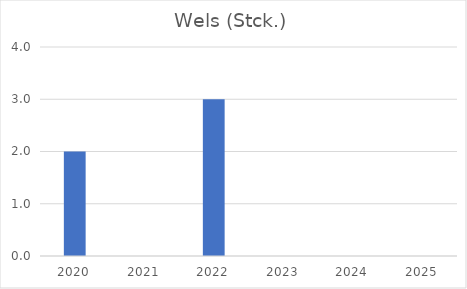
| Category | Wels (Stck.) |
|---|---|
| 2020.0 | 2 |
| 2021.0 | 0 |
| 2022.0 | 3 |
| 2023.0 | 0 |
| 2024.0 | 0 |
| 2025.0 | 0 |